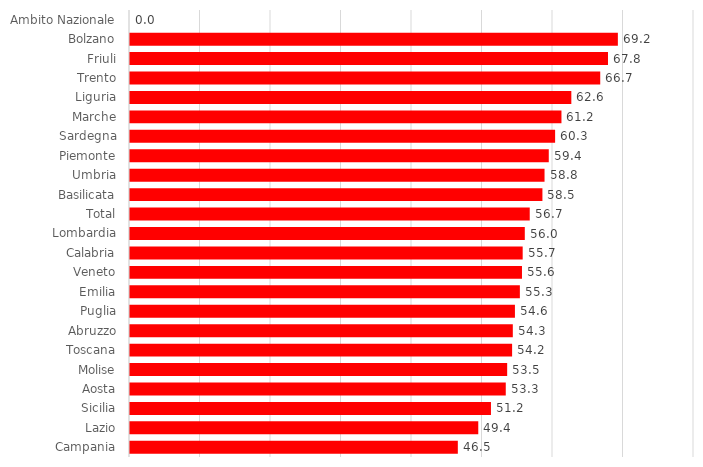
| Category | Series 0 |
|---|---|
| Ambito Nazionale | 0 |
| Bolzano | 69.2 |
| Friuli | 67.8 |
| Trento | 66.7 |
| Liguria | 62.6 |
| Marche | 61.2 |
| Sardegna | 60.3 |
| Piemonte | 59.4 |
| Umbria | 58.8 |
| Basilicata | 58.5 |
| Total | 56.7 |
| Lombardia | 56 |
| Calabria | 55.7 |
| Veneto | 55.6 |
| Emilia | 55.3 |
| Puglia | 54.6 |
| Abruzzo | 54.3 |
| Toscana | 54.2 |
| Molise | 53.5 |
| Aosta | 53.3 |
| Sicilia | 51.2 |
| Lazio | 49.4 |
| Campania | 46.5 |